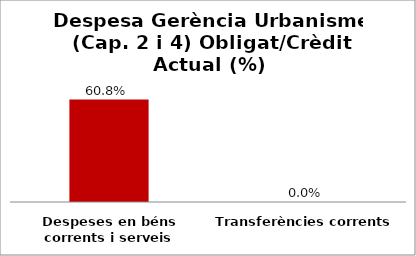
| Category | Series 0 |
|---|---|
| Despeses en béns corrents i serveis | 0.608 |
| Transferències corrents | 0 |